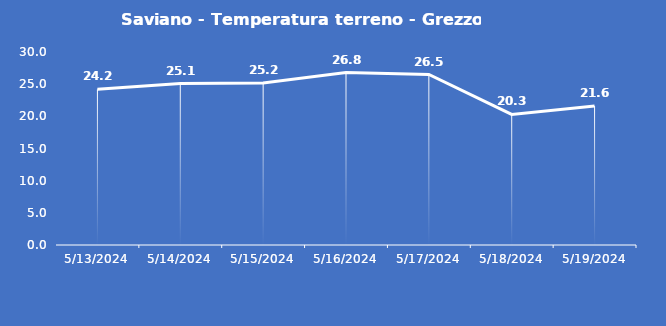
| Category | Saviano - Temperatura terreno - Grezzo (°C) |
|---|---|
| 5/13/24 | 24.2 |
| 5/14/24 | 25.1 |
| 5/15/24 | 25.2 |
| 5/16/24 | 26.8 |
| 5/17/24 | 26.5 |
| 5/18/24 | 20.3 |
| 5/19/24 | 21.6 |